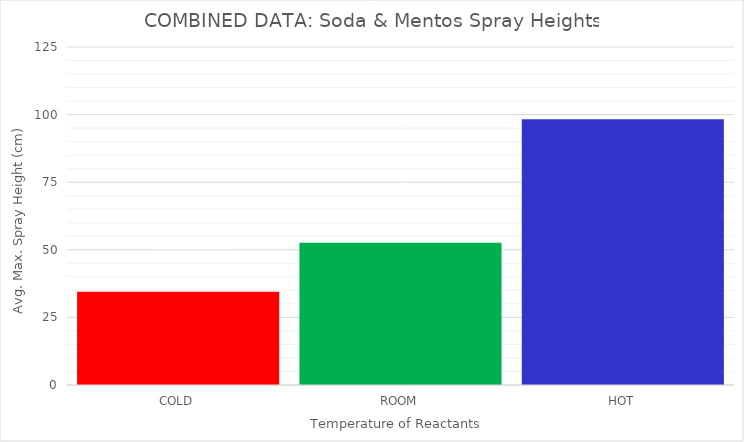
| Category | Series 0 |
|---|---|
| COLD | 34.5 |
| ROOM | 52.625 |
| HOT | 98.25 |